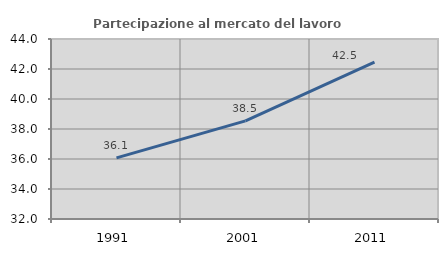
| Category | Partecipazione al mercato del lavoro  femminile |
|---|---|
| 1991.0 | 36.073 |
| 2001.0 | 38.538 |
| 2011.0 | 42.463 |